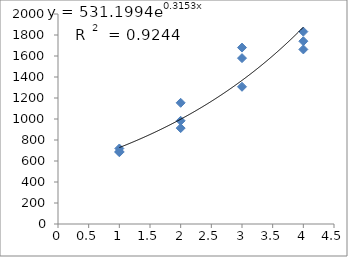
| Category | Series 0 |
|---|---|
| 1.0 | 683.394 |
| 1.0 | 689.903 |
| 1.0 | 719.191 |
| 2.0 | 1154.273 |
| 2.0 | 913.271 |
| 2.0 | 983.035 |
| 3.0 | 1579.711 |
| 3.0 | 1306.852 |
| 3.0 | 1680.238 |
| 4.0 | 1740.891 |
| 4.0 | 1832.174 |
| 4.0 | 1662.649 |